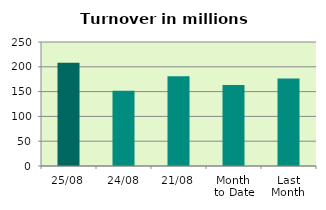
| Category | Series 0 |
|---|---|
| 25/08 | 207.997 |
| 24/08 | 151.475 |
| 21/08 | 181.198 |
| Month 
to Date | 163.212 |
| Last
Month | 176.477 |